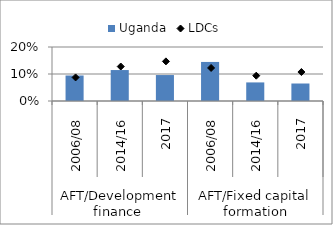
| Category | Uganda |
|---|---|
| 0 | 0.094 |
| 1 | 0.115 |
| 2 | 0.096 |
| 3 | 0.145 |
| 4 | 0.069 |
| 5 | 0.065 |